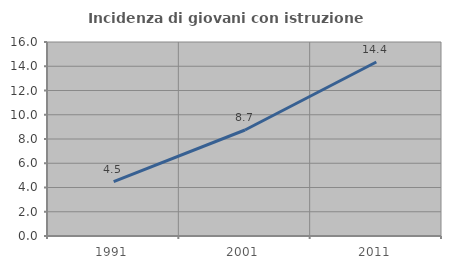
| Category | Incidenza di giovani con istruzione universitaria |
|---|---|
| 1991.0 | 4.489 |
| 2001.0 | 8.743 |
| 2011.0 | 14.354 |